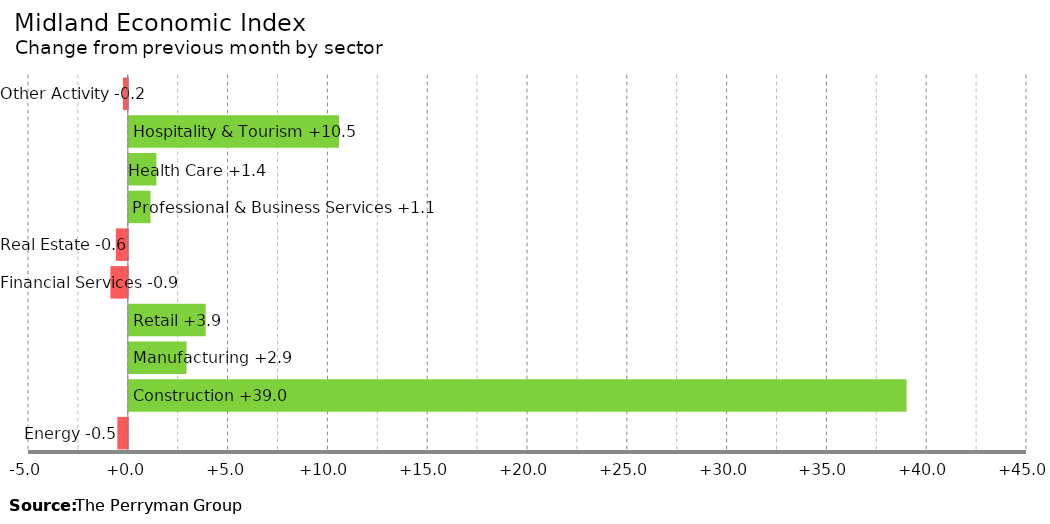
| Category | Change |
|---|---|
| Energy | -0.524 |
| Construction | 38.967 |
| Manufacturing | 2.892 |
| Retail | 3.852 |
| Financial Services | -0.87 |
| Real Estate | -0.6 |
| Professional & Business Services | 1.09 |
| Health Care | 1.382 |
| Hospitality & Tourism | 10.531 |
| Other Activity | -0.244 |